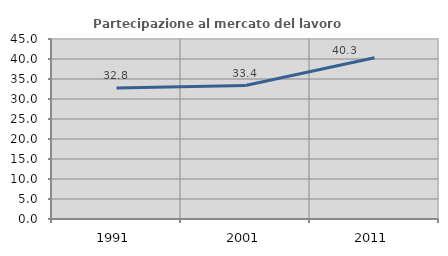
| Category | Partecipazione al mercato del lavoro  femminile |
|---|---|
| 1991.0 | 32.77 |
| 2001.0 | 33.36 |
| 2011.0 | 40.296 |